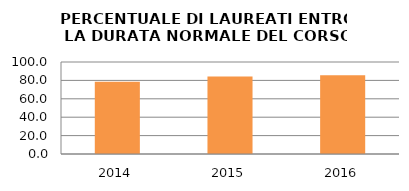
| Category | 2014 2015 2016 |
|---|---|
| 2014.0 | 78.571 |
| 2015.0 | 84.211 |
| 2016.0 | 85.714 |